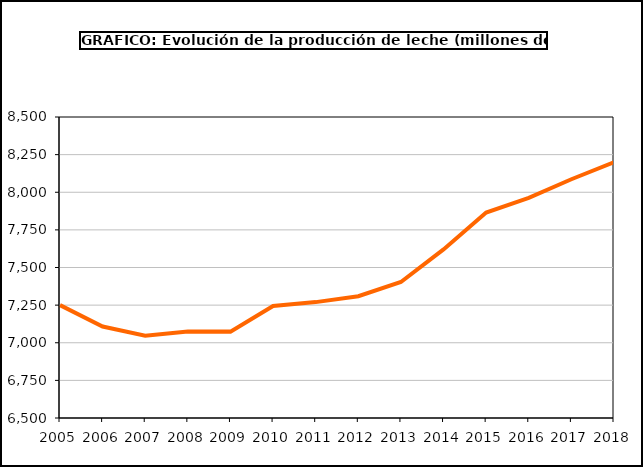
| Category | Total leche |
|---|---|
| 2005.0 | 7249.843 |
| 2006.0 | 7107.75 |
| 2007.0 | 7046.085 |
| 2008.0 | 7074.769 |
| 2009.0 | 7073.924 |
| 2010.0 | 7244.584 |
| 2011.0 | 7270 |
| 2012.0 | 7309.156 |
| 2013.0 | 7403.744 |
| 2014.0 | 7620.059 |
| 2015.0 | 7864.78 |
| 2016.0 | 7963.056 |
| 2017.0 | 8086.554 |
| 2018.0 | 8200.102 |